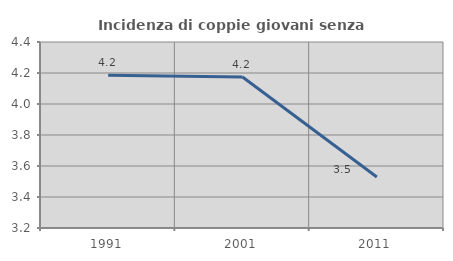
| Category | Incidenza di coppie giovani senza figli |
|---|---|
| 1991.0 | 4.185 |
| 2001.0 | 4.175 |
| 2011.0 | 3.529 |